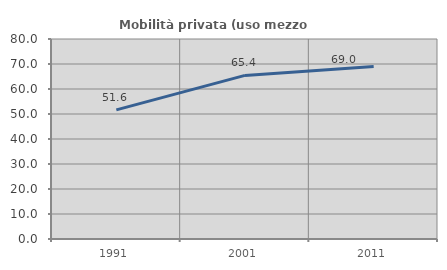
| Category | Mobilità privata (uso mezzo privato) |
|---|---|
| 1991.0 | 51.639 |
| 2001.0 | 65.446 |
| 2011.0 | 69.04 |